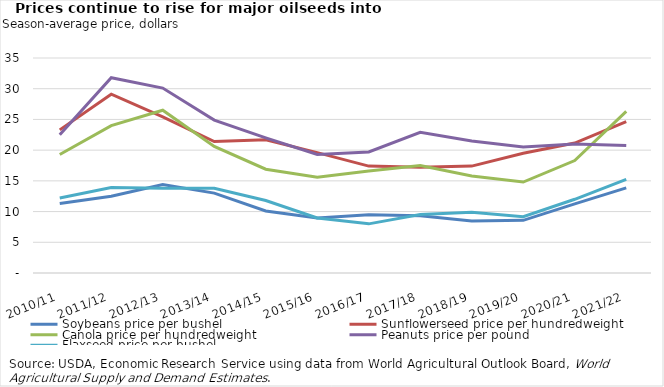
| Category | Soybeans price per bushel | Sunflowerseed price per hundredweight | Canola price per hundredweight | Peanuts price per pound | Flaxseed price per bushel |
|---|---|---|---|---|---|
| 2010/11 | 11.3 | 23.3 | 19.3 | 22.5 | 12.2 |
| 2011/12 | 12.5 | 29.1 | 24 | 31.8 | 13.9 |
| 2012/13 | 14.4 | 25.4 | 26.5 | 30.1 | 13.8 |
| 2013/14 | 13 | 21.4 | 20.6 | 24.9 | 13.8 |
| 2014/15 | 10.1 | 21.7 | 16.9 | 22 | 11.8 |
| 2015/16 | 8.95 | 19.6 | 15.6 | 19.3 | 8.95 |
| 2016/17 | 9.47 | 17.4 | 16.6 | 19.7 | 8 |
| 2017/18 | 9.33 | 17.2 | 17.5 | 22.9 | 9.53 |
| 2018/19 | 8.48 | 17.4 | 15.8 | 21.5 | 9.89 |
| 2019/20 | 8.57 | 19.5 | 14.8 | 20.5 | 9.15 |
| 2020/21 | 11.25 | 21.15 | 18.3 | 21 | 12 |
| 2021/22 | 13.85 | 24.65 | 26.3 | 20.75 | 15.25 |